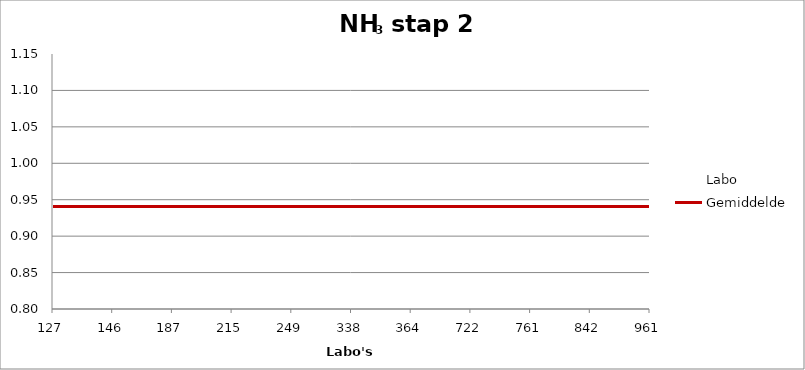
| Category | Labo | Gemiddelde |
|---|---|---|
| 127.0 | 1.017 | 0.941 |
| 146.0 | 0.905 | 0.941 |
| 187.0 | 0.897 | 0.941 |
| 215.0 | 1.086 | 0.941 |
| 249.0 | 0.888 | 0.941 |
| 338.0 | 0.931 | 0.941 |
| 364.0 | 1.095 | 0.941 |
| 722.0 | 0.871 | 0.941 |
| 761.0 | 0.888 | 0.941 |
| 842.0 | 0.914 | 0.941 |
| 961.0 | 0.915 | 0.941 |